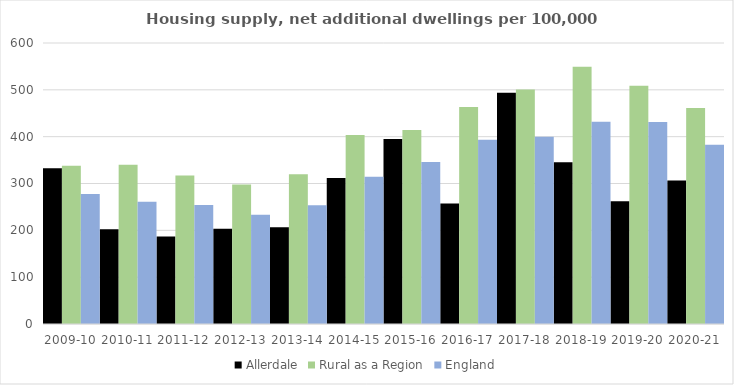
| Category | Allerdale | Rural as a Region | England |
|---|---|---|---|
| 2009-10 | 332.756 | 337.852 | 277.548 |
| 2010-11 | 202.179 | 340.105 | 260.994 |
| 2011-12 | 186.637 | 317.04 | 254.007 |
| 2012-13 | 203.596 | 297.763 | 233.153 |
| 2013-14 | 206.712 | 319.835 | 253.602 |
| 2014-15 | 311.814 | 403.796 | 314.256 |
| 2015-16 | 394.808 | 414.091 | 346.154 |
| 2016-17 | 257.469 | 463.209 | 393.256 |
| 2017-18 | 493.761 | 500.68 | 399.646 |
| 2018-19 | 345.545 | 549.491 | 432.099 |
| 2019-20 | 261.863 | 508.493 | 431.187 |
| 2020-21 | 306.651 | 461.114 | 382.827 |